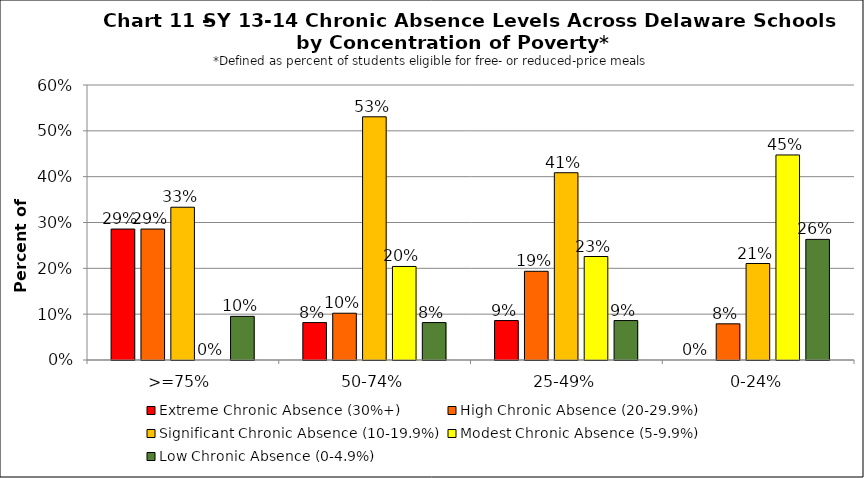
| Category | Extreme Chronic Absence (30%+) | High Chronic Absence (20-29.9%) | Significant Chronic Absence (10-19.9%) | Modest Chronic Absence (5-9.9%) | Low Chronic Absence (0-4.9%) |
|---|---|---|---|---|---|
| 0 | 0.286 | 0.286 | 0.333 | 0 | 0.095 |
| 1 | 0.082 | 0.102 | 0.531 | 0.204 | 0.082 |
| 2 | 0.086 | 0.194 | 0.409 | 0.226 | 0.086 |
| 3 | 0 | 0.079 | 0.211 | 0.447 | 0.263 |